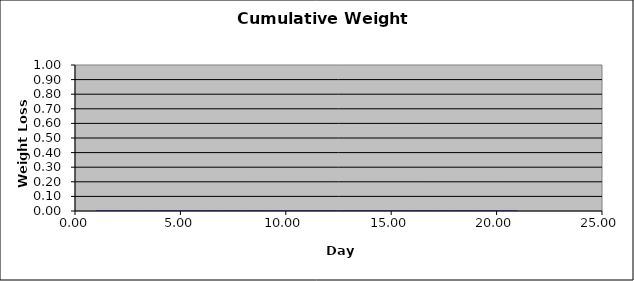
| Category | Fuel Cap |
|---|---|
| 0 | 0 |
| 1 | 0 |
| 2 | 0 |
| 3 | 0 |
| 4 | 0 |
| 5 | 0 |
| 6 | 0 |
| 7 | 0 |
| 8 | 0 |
| 9 | 0 |
| 10 | 0 |
| 11 | 0 |
| 12 | 0 |
| 13 | 0 |
| 14 | 0 |
| 15 | 0 |
| 16 | 0 |
| 17 | 0 |
| 18 | 0 |
| 19 | 0 |
| 20 | 0 |